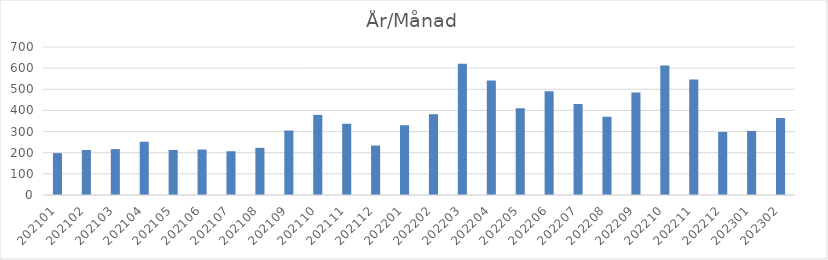
| Category | Summa |
|---|---|
| 202101 | 198 |
| 202102 | 213 |
| 202103 | 217 |
| 202104 | 252 |
| 202105 | 213 |
| 202106 | 215 |
| 202107 | 207 |
| 202108 | 223 |
| 202109 | 305 |
| 202110 | 379 |
| 202111 | 337 |
| 202112 | 234 |
| 202201 | 330 |
| 202202 | 382 |
| 202203 | 621 |
| 202204 | 542 |
| 202205 | 410 |
| 202206 | 491 |
| 202207 | 430 |
| 202208 | 370 |
| 202209 | 485 |
| 202210 | 612 |
| 202211 | 546 |
| 202212 | 298 |
| 202301 | 303 |
| 202302 | 364 |